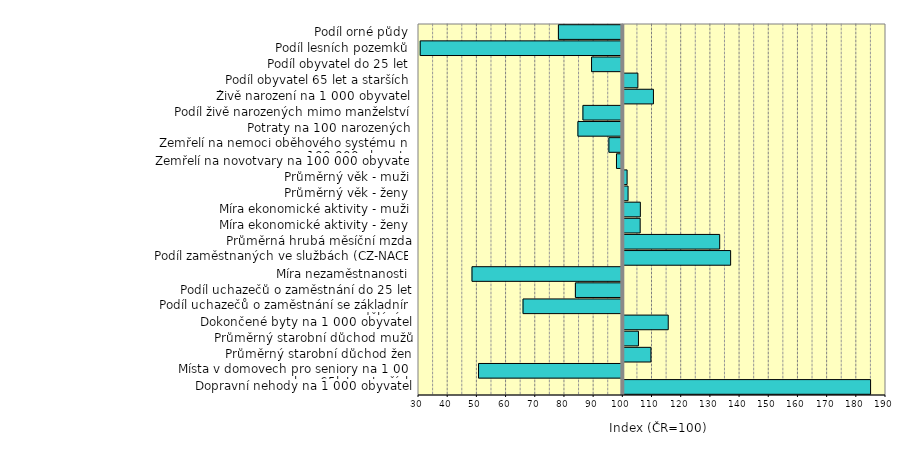
| Category | Series 0 |
|---|---|
| Dopravní nehody na 1 000 obyvatel | 184.719 |
| Místa v domovech pro seniory na 1 000 obyv 65let a starších | 50.571 |
| Průměrný starobní důchod žen | 109.456 |
| Průměrný starobní důchod mužů | 105.189 |
| Dokončené byty na 1 000 obyvatel | 115.394 |
| Podíl uchazečů o zaměstnání se základním vzděláním | 65.818 |
| Podíl uchazečů o zaměstnání do 25 let | 83.756 |
| Míra nezaměstnanosti | 48.33 |
| Podíl zaměstnaných ve službách (CZ-NACE) | 136.77 |
| Průměrná hrubá měsíční mzda | 133.02 |
| Míra ekonomické aktivity - ženy | 105.78 |
| Míra ekonomické aktivity - muži | 105.838 |
| Průměrný věk - ženy | 101.632 |
| Průměrný věk - muži | 101.298 |
| Zemřelí na novotvary na 100 000 obyvatel | 97.83 |
| Zemřelí na nemoci oběhového systému na 100 000 obyvatel | 95.228 |
| Potraty na 100 narozených | 84.619 |
| Podíl živě narozených mimo manželství | 86.338 |
| Živě narození na 1 000 obyvatel | 110.326 |
| Podíl obyvatel 65 let a starších | 104.994 |
| Podíl obyvatel do 25 let | 89.289 |
| Podíl lesních pozemků | 30.584 |
| Podíl orné půdy | 77.937 |